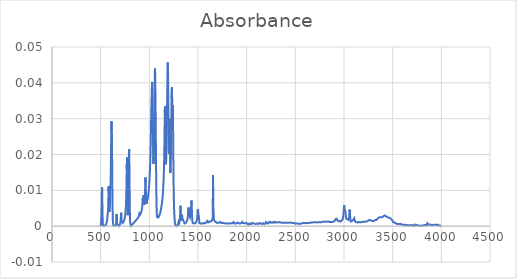
| Category | Absorbance |
|---|---|
| 3997.70514 | 0 |
| 3995.77668 | 0 |
| 3993.84822 | 0 |
| 3991.91975 | 0 |
| 3989.99129 | 0 |
| 3988.06283 | 0 |
| 3986.13436 | 0 |
| 3984.2059 | 0 |
| 3982.27743 | 0 |
| 3980.34897 | 0 |
| 3978.42051 | 0 |
| 3976.49204 | 0 |
| 3974.56358 | 0 |
| 3972.63512 | 0 |
| 3970.70665 | 0 |
| 3968.77819 | 0 |
| 3966.84973 | 0 |
| 3964.92126 | 0 |
| 3962.9928 | 0 |
| 3961.06433 | 0 |
| 3959.13587 | 0 |
| 3957.20741 | 0 |
| 3955.27894 | 0 |
| 3953.35048 | 0 |
| 3951.42202 | 0 |
| 3949.49355 | 0 |
| 3947.56509 | 0 |
| 3945.63663 | 0 |
| 3943.70816 | 0 |
| 3941.7797 | 0 |
| 3939.85123 | 0 |
| 3937.92277 | 0 |
| 3935.99431 | 0 |
| 3934.06584 | 0.001 |
| 3932.13738 | 0.001 |
| 3930.20892 | 0 |
| 3928.28045 | 0 |
| 3926.35199 | 0 |
| 3924.42353 | 0 |
| 3922.49506 | 0 |
| 3920.5666 | 0 |
| 3918.63813 | 0 |
| 3916.70967 | 0 |
| 3914.78121 | 0 |
| 3912.85274 | 0 |
| 3910.92428 | 0 |
| 3908.99582 | 0 |
| 3907.06735 | 0 |
| 3905.13889 | 0 |
| 3903.21043 | 0 |
| 3901.28196 | 0 |
| 3899.3535 | 0.001 |
| 3897.42503 | 0 |
| 3895.49657 | 0 |
| 3893.56811 | 0 |
| 3891.63964 | 0 |
| 3889.71118 | 0 |
| 3887.78272 | 0 |
| 3885.85425 | 0 |
| 3883.92579 | 0 |
| 3881.99733 | 0 |
| 3880.06886 | 0.001 |
| 3878.1404 | 0 |
| 3876.21193 | 0 |
| 3874.28347 | 0 |
| 3872.35501 | 0.001 |
| 3870.42654 | 0.001 |
| 3868.49808 | 0 |
| 3866.56962 | 0 |
| 3864.64115 | 0 |
| 3862.71269 | 0 |
| 3860.78422 | 0 |
| 3858.85576 | 0 |
| 3856.9273 | 0.001 |
| 3854.99883 | 0.001 |
| 3853.07037 | 0.001 |
| 3851.14191 | 0 |
| 3849.21344 | 0 |
| 3847.28498 | 0 |
| 3845.35652 | 0 |
| 3843.42805 | 0 |
| 3841.49959 | 0 |
| 3839.57112 | 0 |
| 3837.64266 | 0 |
| 3835.7142 | 0 |
| 3833.78573 | 0 |
| 3831.85727 | 0 |
| 3829.92881 | 0 |
| 3828.00034 | 0 |
| 3826.07188 | 0 |
| 3824.14342 | 0 |
| 3822.21495 | 0 |
| 3820.28649 | 0 |
| 3818.35802 | 0 |
| 3816.42956 | 0 |
| 3814.5011 | 0 |
| 3812.57263 | 0 |
| 3810.64417 | 0 |
| 3808.71571 | 0 |
| 3806.78724 | 0 |
| 3804.85878 | 0 |
| 3802.93032 | 0 |
| 3801.00185 | 0 |
| 3799.07339 | 0 |
| 3797.14492 | 0 |
| 3795.21646 | 0 |
| 3793.288 | 0 |
| 3791.35953 | 0 |
| 3789.43107 | 0 |
| 3787.50261 | 0 |
| 3785.57414 | 0 |
| 3783.64568 | 0 |
| 3781.71722 | 0 |
| 3779.78875 | 0 |
| 3777.86029 | 0 |
| 3775.93182 | 0 |
| 3774.00336 | 0 |
| 3772.0749 | 0 |
| 3770.14643 | 0 |
| 3768.21797 | 0 |
| 3766.28951 | 0 |
| 3764.36104 | 0 |
| 3762.43258 | 0 |
| 3760.50412 | 0 |
| 3758.57565 | 0 |
| 3756.64719 | 0 |
| 3754.71872 | 0 |
| 3752.79026 | 0 |
| 3750.8618 | 0 |
| 3748.93333 | 0 |
| 3747.00487 | 0 |
| 3745.07641 | 0 |
| 3743.14794 | 0 |
| 3741.21948 | 0 |
| 3739.29102 | 0 |
| 3737.36255 | 0 |
| 3735.43409 | 0 |
| 3733.50562 | 0 |
| 3731.57716 | 0 |
| 3729.6487 | 0 |
| 3727.72023 | 0 |
| 3725.79177 | 0 |
| 3723.86331 | 0 |
| 3721.93484 | 0 |
| 3720.00638 | 0 |
| 3718.07791 | 0 |
| 3716.14945 | 0 |
| 3714.22099 | 0 |
| 3712.29252 | 0 |
| 3710.36406 | 0 |
| 3708.4356 | 0 |
| 3706.50713 | 0 |
| 3704.57867 | 0 |
| 3702.65021 | 0 |
| 3700.72174 | 0 |
| 3698.79328 | 0 |
| 3696.86481 | 0 |
| 3694.93635 | 0 |
| 3693.00789 | 0 |
| 3691.07942 | 0 |
| 3689.15096 | 0 |
| 3687.2225 | 0 |
| 3685.29403 | 0 |
| 3683.36557 | 0 |
| 3681.43711 | 0 |
| 3679.50864 | 0 |
| 3677.58018 | 0 |
| 3675.65171 | 0 |
| 3673.72325 | 0 |
| 3671.79479 | 0 |
| 3669.86632 | 0 |
| 3667.93786 | 0 |
| 3666.0094 | 0 |
| 3664.08093 | 0 |
| 3662.15247 | 0 |
| 3660.22401 | 0 |
| 3658.29554 | 0 |
| 3656.36708 | 0 |
| 3654.43861 | 0 |
| 3652.51015 | 0 |
| 3650.58169 | 0 |
| 3648.65322 | 0 |
| 3646.72476 | 0.001 |
| 3644.7963 | 0 |
| 3642.86783 | 0 |
| 3640.93937 | 0 |
| 3639.01091 | 0 |
| 3637.08244 | 0 |
| 3635.15398 | 0 |
| 3633.22551 | 0 |
| 3631.29705 | 0 |
| 3629.36859 | 0 |
| 3627.44012 | 0 |
| 3625.51166 | 0 |
| 3623.5832 | 0 |
| 3621.65473 | 0 |
| 3619.72627 | 0 |
| 3617.79781 | 0 |
| 3615.86934 | 0 |
| 3613.94088 | 0 |
| 3612.01241 | 0 |
| 3610.08395 | 0 |
| 3608.15549 | 0 |
| 3606.22702 | 0 |
| 3604.29856 | 0 |
| 3602.3701 | 0 |
| 3600.44163 | 0.001 |
| 3598.51317 | 0.001 |
| 3596.58471 | 0.001 |
| 3594.65624 | 0 |
| 3592.72778 | 0 |
| 3590.79931 | 0 |
| 3588.87085 | 0 |
| 3586.94239 | 0.001 |
| 3585.01392 | 0.001 |
| 3583.08546 | 0.001 |
| 3581.157 | 0.001 |
| 3579.22853 | 0.001 |
| 3577.30007 | 0.001 |
| 3575.3716 | 0.001 |
| 3573.44314 | 0.001 |
| 3571.51468 | 0.001 |
| 3569.58621 | 0.001 |
| 3567.65775 | 0.001 |
| 3565.72929 | 0.001 |
| 3563.80082 | 0.001 |
| 3561.87236 | 0.001 |
| 3559.9439 | 0.001 |
| 3558.01543 | 0.001 |
| 3556.08697 | 0.001 |
| 3554.1585 | 0.001 |
| 3552.23004 | 0.001 |
| 3550.30158 | 0.001 |
| 3548.37311 | 0.001 |
| 3546.44465 | 0.001 |
| 3544.51619 | 0.001 |
| 3542.58772 | 0.001 |
| 3540.65926 | 0.001 |
| 3538.7308 | 0.001 |
| 3536.80233 | 0.001 |
| 3534.87387 | 0.001 |
| 3532.9454 | 0.001 |
| 3531.01694 | 0.001 |
| 3529.08848 | 0.001 |
| 3527.16001 | 0.001 |
| 3525.23155 | 0.001 |
| 3523.30309 | 0.001 |
| 3521.37462 | 0.001 |
| 3519.44616 | 0.001 |
| 3517.5177 | 0.001 |
| 3515.58923 | 0.001 |
| 3513.66077 | 0.001 |
| 3511.7323 | 0.001 |
| 3509.80384 | 0.001 |
| 3507.87538 | 0.001 |
| 3505.94691 | 0.001 |
| 3504.01845 | 0.001 |
| 3502.08999 | 0.001 |
| 3500.16152 | 0.001 |
| 3498.23306 | 0.002 |
| 3496.3046 | 0.002 |
| 3494.37613 | 0.002 |
| 3492.44767 | 0.002 |
| 3490.5192 | 0.002 |
| 3488.59074 | 0.002 |
| 3486.66228 | 0.002 |
| 3484.73381 | 0.002 |
| 3482.80535 | 0.002 |
| 3480.87689 | 0.002 |
| 3478.94842 | 0.002 |
| 3477.01996 | 0.002 |
| 3475.0915 | 0.002 |
| 3473.16303 | 0.002 |
| 3471.23457 | 0.002 |
| 3469.3061 | 0.002 |
| 3467.37764 | 0.002 |
| 3465.44918 | 0.002 |
| 3463.52071 | 0.002 |
| 3461.59225 | 0.002 |
| 3459.66379 | 0.002 |
| 3457.73532 | 0.002 |
| 3455.80686 | 0.002 |
| 3453.8784 | 0.002 |
| 3451.94993 | 0.002 |
| 3450.02147 | 0.003 |
| 3448.093 | 0.003 |
| 3446.16454 | 0.003 |
| 3444.23608 | 0.003 |
| 3442.30761 | 0.003 |
| 3440.37915 | 0.003 |
| 3438.45069 | 0.003 |
| 3436.52222 | 0.003 |
| 3434.59376 | 0.003 |
| 3432.66529 | 0.003 |
| 3430.73683 | 0.003 |
| 3428.80837 | 0.003 |
| 3426.8799 | 0.003 |
| 3424.95144 | 0.003 |
| 3423.02298 | 0.003 |
| 3421.09451 | 0.003 |
| 3419.16605 | 0.003 |
| 3417.23759 | 0.003 |
| 3415.30912 | 0.003 |
| 3413.38066 | 0.003 |
| 3411.45219 | 0.003 |
| 3409.52373 | 0.003 |
| 3407.59527 | 0.003 |
| 3405.6668 | 0.003 |
| 3403.73834 | 0.003 |
| 3401.80988 | 0.003 |
| 3399.88141 | 0.003 |
| 3397.95295 | 0.003 |
| 3396.02449 | 0.003 |
| 3394.09602 | 0.003 |
| 3392.16756 | 0.003 |
| 3390.23909 | 0.003 |
| 3388.31063 | 0.003 |
| 3386.38217 | 0.003 |
| 3384.4537 | 0.003 |
| 3382.52524 | 0.003 |
| 3380.59678 | 0.003 |
| 3378.66831 | 0.003 |
| 3376.73985 | 0.003 |
| 3374.81139 | 0.003 |
| 3372.88292 | 0.002 |
| 3370.95446 | 0.002 |
| 3369.02599 | 0.003 |
| 3367.09753 | 0.002 |
| 3365.16907 | 0.002 |
| 3363.2406 | 0.002 |
| 3361.31214 | 0.002 |
| 3359.38368 | 0.002 |
| 3357.45521 | 0.002 |
| 3355.52675 | 0.002 |
| 3353.59829 | 0.002 |
| 3351.66982 | 0.002 |
| 3349.74136 | 0.002 |
| 3347.81289 | 0.002 |
| 3345.88443 | 0.002 |
| 3343.95597 | 0.002 |
| 3342.0275 | 0.002 |
| 3340.09904 | 0.002 |
| 3338.17058 | 0.002 |
| 3336.24211 | 0.002 |
| 3334.31365 | 0.002 |
| 3332.38519 | 0.002 |
| 3330.45672 | 0.002 |
| 3328.52826 | 0.002 |
| 3326.59979 | 0.002 |
| 3324.67133 | 0.002 |
| 3322.74287 | 0.002 |
| 3320.8144 | 0.002 |
| 3318.88594 | 0.002 |
| 3316.95748 | 0.002 |
| 3315.02901 | 0.002 |
| 3313.10055 | 0.002 |
| 3311.17208 | 0.002 |
| 3309.24362 | 0.002 |
| 3307.31516 | 0.001 |
| 3305.38669 | 0.001 |
| 3303.45823 | 0.001 |
| 3301.52977 | 0.001 |
| 3299.6013 | 0.001 |
| 3297.67284 | 0.001 |
| 3295.74438 | 0.001 |
| 3293.81591 | 0.001 |
| 3291.88745 | 0.001 |
| 3289.95898 | 0.001 |
| 3288.03052 | 0.001 |
| 3286.10206 | 0.001 |
| 3284.17359 | 0.002 |
| 3282.24513 | 0.002 |
| 3280.31667 | 0.002 |
| 3278.3882 | 0.002 |
| 3276.45974 | 0.002 |
| 3274.53128 | 0.002 |
| 3272.60281 | 0.002 |
| 3270.67435 | 0.002 |
| 3268.74588 | 0.002 |
| 3266.81742 | 0.002 |
| 3264.88896 | 0.002 |
| 3262.96049 | 0.002 |
| 3261.03203 | 0.002 |
| 3259.10357 | 0.002 |
| 3257.1751 | 0.002 |
| 3255.24664 | 0.002 |
| 3253.31818 | 0.002 |
| 3251.38971 | 0.002 |
| 3249.46125 | 0.002 |
| 3247.53278 | 0.002 |
| 3245.60432 | 0.001 |
| 3243.67586 | 0.001 |
| 3241.74739 | 0.001 |
| 3239.81893 | 0.001 |
| 3237.89047 | 0.001 |
| 3235.962 | 0.001 |
| 3234.03354 | 0.001 |
| 3232.10508 | 0.001 |
| 3230.17661 | 0.001 |
| 3228.24815 | 0.001 |
| 3226.31968 | 0.001 |
| 3224.39122 | 0.001 |
| 3222.46276 | 0.001 |
| 3220.53429 | 0.001 |
| 3218.60583 | 0.001 |
| 3216.67737 | 0.001 |
| 3214.7489 | 0.001 |
| 3212.82044 | 0.001 |
| 3210.89198 | 0.001 |
| 3208.96351 | 0.001 |
| 3207.03505 | 0.001 |
| 3205.10658 | 0.001 |
| 3203.17812 | 0.001 |
| 3201.24966 | 0.001 |
| 3199.32119 | 0.001 |
| 3197.39273 | 0.001 |
| 3195.46427 | 0.001 |
| 3193.5358 | 0.001 |
| 3191.60734 | 0.001 |
| 3189.67888 | 0.001 |
| 3187.75041 | 0.001 |
| 3185.82195 | 0.001 |
| 3183.89348 | 0.001 |
| 3181.96502 | 0.001 |
| 3180.03656 | 0.001 |
| 3178.10809 | 0.001 |
| 3176.17963 | 0.001 |
| 3174.25117 | 0.001 |
| 3172.3227 | 0.001 |
| 3170.39424 | 0.001 |
| 3168.46577 | 0.001 |
| 3166.53731 | 0.001 |
| 3164.60885 | 0.001 |
| 3162.68038 | 0.001 |
| 3160.75192 | 0.001 |
| 3158.82346 | 0.001 |
| 3156.89499 | 0.001 |
| 3154.96653 | 0.001 |
| 3153.03807 | 0.001 |
| 3151.1096 | 0.001 |
| 3149.18114 | 0.001 |
| 3147.25267 | 0.001 |
| 3145.32421 | 0.001 |
| 3143.39575 | 0.001 |
| 3141.46728 | 0.001 |
| 3139.53882 | 0.001 |
| 3137.61036 | 0.001 |
| 3135.68189 | 0.001 |
| 3133.75343 | 0.001 |
| 3131.82497 | 0.001 |
| 3129.8965 | 0.001 |
| 3127.96804 | 0.001 |
| 3126.03957 | 0.001 |
| 3124.11111 | 0.001 |
| 3122.18265 | 0.001 |
| 3120.25418 | 0.001 |
| 3118.32572 | 0.001 |
| 3116.39726 | 0.001 |
| 3114.46879 | 0.001 |
| 3112.54033 | 0.001 |
| 3110.61187 | 0.001 |
| 3108.6834 | 0.002 |
| 3106.75494 | 0.002 |
| 3104.82647 | 0.002 |
| 3102.89801 | 0.002 |
| 3100.96955 | 0.002 |
| 3099.04108 | 0.002 |
| 3097.11262 | 0.002 |
| 3095.18416 | 0.002 |
| 3093.25569 | 0.002 |
| 3091.32723 | 0.002 |
| 3089.39877 | 0.002 |
| 3087.4703 | 0.002 |
| 3085.54184 | 0.002 |
| 3083.61337 | 0.002 |
| 3081.68491 | 0.001 |
| 3079.75645 | 0.001 |
| 3077.82798 | 0.001 |
| 3075.89952 | 0.001 |
| 3073.97106 | 0.001 |
| 3072.04259 | 0.001 |
| 3070.11413 | 0.001 |
| 3068.18567 | 0.001 |
| 3066.2572 | 0.002 |
| 3064.32874 | 0.002 |
| 3062.40027 | 0.003 |
| 3060.47181 | 0.004 |
| 3058.54335 | 0.005 |
| 3056.61488 | 0.004 |
| 3054.68642 | 0.003 |
| 3052.75796 | 0.002 |
| 3050.82949 | 0.002 |
| 3048.90103 | 0.002 |
| 3046.97257 | 0.002 |
| 3045.0441 | 0.002 |
| 3043.11564 | 0.002 |
| 3041.18717 | 0.002 |
| 3039.25871 | 0.002 |
| 3037.33025 | 0.002 |
| 3035.40178 | 0.002 |
| 3033.47332 | 0.002 |
| 3031.54486 | 0.002 |
| 3029.61639 | 0.002 |
| 3027.68793 | 0.002 |
| 3025.75946 | 0.002 |
| 3023.831 | 0.002 |
| 3021.90254 | 0.002 |
| 3019.97407 | 0.003 |
| 3018.04561 | 0.003 |
| 3016.11715 | 0.004 |
| 3014.18868 | 0.004 |
| 3012.26022 | 0.004 |
| 3010.33176 | 0.004 |
| 3008.40329 | 0.004 |
| 3006.47483 | 0.005 |
| 3004.54636 | 0.005 |
| 3002.6179 | 0.006 |
| 3000.68944 | 0.006 |
| 2998.76097 | 0.005 |
| 2996.83251 | 0.004 |
| 2994.90405 | 0.003 |
| 2992.97558 | 0.003 |
| 2991.04712 | 0.003 |
| 2989.11866 | 0.002 |
| 2987.19019 | 0.002 |
| 2985.26173 | 0.002 |
| 2983.33326 | 0.002 |
| 2981.4048 | 0.002 |
| 2979.47634 | 0.002 |
| 2977.54787 | 0.002 |
| 2975.61941 | 0.002 |
| 2973.69095 | 0.002 |
| 2971.76248 | 0.001 |
| 2969.83402 | 0.001 |
| 2967.90556 | 0.001 |
| 2965.97709 | 0.001 |
| 2964.04863 | 0.001 |
| 2962.12016 | 0.001 |
| 2960.1917 | 0.001 |
| 2958.26324 | 0.001 |
| 2956.33477 | 0.001 |
| 2954.40631 | 0.001 |
| 2952.47785 | 0.001 |
| 2950.54938 | 0.001 |
| 2948.62092 | 0.001 |
| 2946.69246 | 0.001 |
| 2944.76399 | 0.001 |
| 2942.83553 | 0.001 |
| 2940.90706 | 0.001 |
| 2938.9786 | 0.001 |
| 2937.05014 | 0.001 |
| 2935.12167 | 0.001 |
| 2933.19321 | 0.001 |
| 2931.26475 | 0.002 |
| 2929.33628 | 0.002 |
| 2927.40782 | 0.002 |
| 2925.47936 | 0.002 |
| 2923.55089 | 0.002 |
| 2921.62243 | 0.002 |
| 2919.69396 | 0.002 |
| 2917.7655 | 0.002 |
| 2915.83704 | 0.002 |
| 2913.90857 | 0.002 |
| 2911.98011 | 0.002 |
| 2910.05165 | 0.002 |
| 2908.12318 | 0.002 |
| 2906.19472 | 0.002 |
| 2904.26626 | 0.001 |
| 2902.33779 | 0.001 |
| 2900.40933 | 0.001 |
| 2898.48086 | 0.001 |
| 2896.5524 | 0.001 |
| 2894.62394 | 0.001 |
| 2892.69547 | 0.001 |
| 2890.76701 | 0.001 |
| 2888.83855 | 0.001 |
| 2886.91008 | 0.001 |
| 2884.98162 | 0.001 |
| 2883.05315 | 0.001 |
| 2881.12469 | 0.001 |
| 2879.19623 | 0.001 |
| 2877.26776 | 0.001 |
| 2875.3393 | 0.001 |
| 2873.41084 | 0.001 |
| 2871.48237 | 0.001 |
| 2869.55391 | 0.001 |
| 2867.62545 | 0.001 |
| 2865.69698 | 0.001 |
| 2863.76852 | 0.001 |
| 2861.84005 | 0.001 |
| 2859.91159 | 0.001 |
| 2857.98313 | 0.001 |
| 2856.05466 | 0.001 |
| 2854.1262 | 0.001 |
| 2852.19774 | 0.001 |
| 2850.26927 | 0.001 |
| 2848.34081 | 0.001 |
| 2846.41235 | 0.001 |
| 2844.48388 | 0.001 |
| 2842.55542 | 0.001 |
| 2840.62695 | 0.001 |
| 2838.69849 | 0.001 |
| 2836.77003 | 0.001 |
| 2834.84156 | 0.001 |
| 2832.9131 | 0.001 |
| 2830.98464 | 0.001 |
| 2829.05617 | 0.001 |
| 2827.12771 | 0.001 |
| 2825.19925 | 0.001 |
| 2823.27078 | 0.001 |
| 2821.34232 | 0.001 |
| 2819.41385 | 0.001 |
| 2817.48539 | 0.001 |
| 2815.55693 | 0.001 |
| 2813.62846 | 0.001 |
| 2811.7 | 0.001 |
| 2809.77154 | 0.001 |
| 2807.84307 | 0.001 |
| 2805.91461 | 0.001 |
| 2803.98615 | 0.001 |
| 2802.05768 | 0.001 |
| 2800.12922 | 0.001 |
| 2798.20075 | 0.001 |
| 2796.27229 | 0.001 |
| 2794.34383 | 0.001 |
| 2792.41536 | 0.001 |
| 2790.4869 | 0.001 |
| 2788.55844 | 0.001 |
| 2786.62997 | 0.001 |
| 2784.70151 | 0.001 |
| 2782.77305 | 0.001 |
| 2780.84458 | 0.001 |
| 2778.91612 | 0.001 |
| 2776.98765 | 0.001 |
| 2775.05919 | 0.001 |
| 2773.13073 | 0.001 |
| 2771.20226 | 0.001 |
| 2769.2738 | 0.001 |
| 2767.34534 | 0.001 |
| 2765.41687 | 0.001 |
| 2763.48841 | 0.001 |
| 2761.55995 | 0.001 |
| 2759.63148 | 0.001 |
| 2757.70302 | 0.001 |
| 2755.77455 | 0.001 |
| 2753.84609 | 0.001 |
| 2751.91763 | 0.001 |
| 2749.98916 | 0.001 |
| 2748.0607 | 0.001 |
| 2746.13224 | 0.001 |
| 2744.20377 | 0.001 |
| 2742.27531 | 0.001 |
| 2740.34684 | 0.001 |
| 2738.41838 | 0.001 |
| 2736.48992 | 0.001 |
| 2734.56145 | 0.001 |
| 2732.63299 | 0.001 |
| 2730.70453 | 0.001 |
| 2728.77606 | 0.001 |
| 2726.8476 | 0.001 |
| 2724.91914 | 0.001 |
| 2722.99067 | 0.001 |
| 2721.06221 | 0.001 |
| 2719.13374 | 0.001 |
| 2717.20528 | 0.001 |
| 2715.27682 | 0.001 |
| 2713.34835 | 0.001 |
| 2711.41989 | 0.001 |
| 2709.49143 | 0.001 |
| 2707.56296 | 0.001 |
| 2705.6345 | 0.001 |
| 2703.70604 | 0.001 |
| 2701.77757 | 0.001 |
| 2699.84911 | 0.001 |
| 2697.92064 | 0.001 |
| 2695.99218 | 0.001 |
| 2694.06372 | 0.001 |
| 2692.13525 | 0.001 |
| 2690.20679 | 0.001 |
| 2688.27833 | 0.001 |
| 2686.34986 | 0.001 |
| 2684.4214 | 0.001 |
| 2682.49294 | 0.001 |
| 2680.56447 | 0.001 |
| 2678.63601 | 0.001 |
| 2676.70754 | 0.001 |
| 2674.77908 | 0.001 |
| 2672.85062 | 0.001 |
| 2670.92215 | 0.001 |
| 2668.99369 | 0.001 |
| 2667.06523 | 0.001 |
| 2665.13676 | 0.001 |
| 2663.2083 | 0.001 |
| 2661.27984 | 0.001 |
| 2659.35137 | 0.001 |
| 2657.42291 | 0.001 |
| 2655.49444 | 0.001 |
| 2653.56598 | 0.001 |
| 2651.63752 | 0.001 |
| 2649.70905 | 0.001 |
| 2647.78059 | 0.001 |
| 2645.85213 | 0.001 |
| 2643.92366 | 0.001 |
| 2641.9952 | 0.001 |
| 2640.06674 | 0.001 |
| 2638.13827 | 0.001 |
| 2636.20981 | 0.001 |
| 2634.28134 | 0.001 |
| 2632.35288 | 0.001 |
| 2630.42442 | 0.001 |
| 2628.49595 | 0.001 |
| 2626.56749 | 0.001 |
| 2624.63903 | 0.001 |
| 2622.71056 | 0.001 |
| 2620.7821 | 0.001 |
| 2618.85364 | 0.001 |
| 2616.92517 | 0.001 |
| 2614.99671 | 0.001 |
| 2613.06824 | 0.001 |
| 2611.13978 | 0.001 |
| 2609.21132 | 0.001 |
| 2607.28285 | 0.001 |
| 2605.35439 | 0.001 |
| 2603.42593 | 0.001 |
| 2601.49746 | 0.001 |
| 2599.569 | 0.001 |
| 2597.64053 | 0.001 |
| 2595.71207 | 0.001 |
| 2593.78361 | 0.001 |
| 2591.85514 | 0.001 |
| 2589.92668 | 0.001 |
| 2587.99822 | 0.001 |
| 2586.06975 | 0.001 |
| 2584.14129 | 0.001 |
| 2582.21283 | 0.001 |
| 2580.28436 | 0.001 |
| 2578.3559 | 0.001 |
| 2576.42743 | 0.001 |
| 2574.49897 | 0.001 |
| 2572.57051 | 0.001 |
| 2570.64204 | 0.001 |
| 2568.71358 | 0.001 |
| 2566.78512 | 0.001 |
| 2564.85665 | 0.001 |
| 2562.92819 | 0.001 |
| 2560.99973 | 0.001 |
| 2559.07126 | 0.001 |
| 2557.1428 | 0.001 |
| 2555.21433 | 0.001 |
| 2553.28587 | 0.001 |
| 2551.35741 | 0.001 |
| 2549.42894 | 0.001 |
| 2547.50048 | 0.001 |
| 2545.57202 | 0.001 |
| 2543.64355 | 0.001 |
| 2541.71509 | 0.001 |
| 2539.78663 | 0.001 |
| 2537.85816 | 0.001 |
| 2535.9297 | 0.001 |
| 2534.00123 | 0.001 |
| 2532.07277 | 0.001 |
| 2530.14431 | 0.001 |
| 2528.21584 | 0.001 |
| 2526.28738 | 0.001 |
| 2524.35892 | 0.001 |
| 2522.43045 | 0.001 |
| 2520.50199 | 0.001 |
| 2518.57353 | 0.001 |
| 2516.64506 | 0.001 |
| 2514.7166 | 0.001 |
| 2512.78813 | 0.001 |
| 2510.85967 | 0.001 |
| 2508.93121 | 0.001 |
| 2507.00274 | 0.001 |
| 2505.07428 | 0.001 |
| 2503.14582 | 0.001 |
| 2501.21735 | 0.001 |
| 2499.28889 | 0.001 |
| 2497.36043 | 0.001 |
| 2495.43196 | 0.001 |
| 2493.5035 | 0.001 |
| 2491.57503 | 0.001 |
| 2489.64657 | 0.001 |
| 2487.71811 | 0.001 |
| 2485.78964 | 0.001 |
| 2483.86118 | 0.001 |
| 2481.93272 | 0.001 |
| 2480.00425 | 0.001 |
| 2478.07579 | 0.001 |
| 2476.14733 | 0.001 |
| 2474.21886 | 0.001 |
| 2472.2904 | 0.001 |
| 2470.36193 | 0.001 |
| 2468.43347 | 0.001 |
| 2466.50501 | 0.001 |
| 2464.57654 | 0.001 |
| 2462.64808 | 0.001 |
| 2460.71962 | 0.001 |
| 2458.79115 | 0.001 |
| 2456.86269 | 0.001 |
| 2454.93422 | 0.001 |
| 2453.00576 | 0.001 |
| 2451.0773 | 0.001 |
| 2449.14883 | 0.001 |
| 2447.22037 | 0.001 |
| 2445.29191 | 0.001 |
| 2443.36344 | 0.001 |
| 2441.43498 | 0.001 |
| 2439.50652 | 0.001 |
| 2437.57805 | 0.001 |
| 2435.64959 | 0.001 |
| 2433.72112 | 0.001 |
| 2431.79266 | 0.001 |
| 2429.8642 | 0.001 |
| 2427.93573 | 0.001 |
| 2426.00727 | 0.001 |
| 2424.07881 | 0.001 |
| 2422.15034 | 0.001 |
| 2420.22188 | 0.001 |
| 2418.29342 | 0.001 |
| 2416.36495 | 0.001 |
| 2414.43649 | 0.001 |
| 2412.50802 | 0.001 |
| 2410.57956 | 0.001 |
| 2408.6511 | 0.001 |
| 2406.72263 | 0.001 |
| 2404.79417 | 0.001 |
| 2402.86571 | 0.001 |
| 2400.93724 | 0.001 |
| 2399.00878 | 0.001 |
| 2397.08032 | 0.001 |
| 2395.15185 | 0.001 |
| 2393.22339 | 0.001 |
| 2391.29492 | 0.001 |
| 2389.36646 | 0.001 |
| 2387.438 | 0.001 |
| 2385.50953 | 0.001 |
| 2383.58107 | 0.001 |
| 2381.65261 | 0.001 |
| 2379.72414 | 0.001 |
| 2377.79568 | 0.001 |
| 2375.86722 | 0.001 |
| 2373.93875 | 0.001 |
| 2372.01029 | 0.001 |
| 2370.08182 | 0.001 |
| 2368.15336 | 0.001 |
| 2366.2249 | 0.001 |
| 2364.29643 | 0.001 |
| 2362.36797 | 0.001 |
| 2360.43951 | 0.001 |
| 2358.51104 | 0.001 |
| 2356.58258 | 0.001 |
| 2354.65412 | 0.001 |
| 2352.72565 | 0.001 |
| 2350.79719 | 0.001 |
| 2348.86872 | 0.001 |
| 2346.94026 | 0.001 |
| 2345.0118 | 0.001 |
| 2343.08333 | 0.001 |
| 2341.15487 | 0.001 |
| 2339.22641 | 0.001 |
| 2337.29794 | 0.001 |
| 2335.36948 | 0.001 |
| 2333.44102 | 0.001 |
| 2331.51255 | 0.001 |
| 2329.58409 | 0.001 |
| 2327.65562 | 0.001 |
| 2325.72716 | 0.001 |
| 2323.7987 | 0.001 |
| 2321.87023 | 0.001 |
| 2319.94177 | 0.001 |
| 2318.01331 | 0.001 |
| 2316.08484 | 0.001 |
| 2314.15638 | 0.001 |
| 2312.22791 | 0.001 |
| 2310.29945 | 0.001 |
| 2308.37099 | 0.001 |
| 2306.44252 | 0.001 |
| 2304.51406 | 0.001 |
| 2302.5856 | 0.001 |
| 2300.65713 | 0.001 |
| 2298.72867 | 0.001 |
| 2296.80021 | 0.001 |
| 2294.87174 | 0.001 |
| 2292.94328 | 0.001 |
| 2291.01481 | 0.001 |
| 2289.08635 | 0.001 |
| 2287.15789 | 0.001 |
| 2285.22942 | 0.001 |
| 2283.30096 | 0.001 |
| 2281.3725 | 0.001 |
| 2279.44403 | 0.001 |
| 2277.51557 | 0.001 |
| 2275.58711 | 0.001 |
| 2273.65864 | 0.001 |
| 2271.73018 | 0.001 |
| 2269.80171 | 0.001 |
| 2267.87325 | 0.001 |
| 2265.94479 | 0.001 |
| 2264.01632 | 0.001 |
| 2262.08786 | 0.001 |
| 2260.1594 | 0.001 |
| 2258.23093 | 0.001 |
| 2256.30247 | 0.001 |
| 2254.37401 | 0.001 |
| 2252.44554 | 0.001 |
| 2250.51708 | 0.001 |
| 2248.58861 | 0.001 |
| 2246.66015 | 0.001 |
| 2244.73169 | 0.001 |
| 2242.80322 | 0.001 |
| 2240.87476 | 0.001 |
| 2238.9463 | 0.001 |
| 2237.01783 | 0.001 |
| 2235.08937 | 0.001 |
| 2233.16091 | 0.001 |
| 2231.23244 | 0.001 |
| 2229.30398 | 0.001 |
| 2227.37551 | 0.001 |
| 2225.44705 | 0.001 |
| 2223.51859 | 0.001 |
| 2221.59012 | 0.001 |
| 2219.66166 | 0.001 |
| 2217.7332 | 0.001 |
| 2215.80473 | 0.001 |
| 2213.87627 | 0.001 |
| 2211.94781 | 0.001 |
| 2210.01934 | 0.001 |
| 2208.09088 | 0.001 |
| 2206.16241 | 0.001 |
| 2204.23395 | 0.001 |
| 2202.30549 | 0.001 |
| 2200.37702 | 0.001 |
| 2198.44856 | 0.001 |
| 2196.5201 | 0.001 |
| 2194.59163 | 0.001 |
| 2192.66317 | 0.001 |
| 2190.73471 | 0.001 |
| 2188.80624 | 0.001 |
| 2186.87778 | 0.001 |
| 2184.94931 | 0.001 |
| 2183.02085 | 0.001 |
| 2181.09239 | 0.001 |
| 2179.16392 | 0.001 |
| 2177.23546 | 0.001 |
| 2175.307 | 0.001 |
| 2173.37853 | 0.001 |
| 2171.45007 | 0.001 |
| 2169.5216 | 0.001 |
| 2167.59314 | 0.001 |
| 2165.66468 | 0.001 |
| 2163.73621 | 0.001 |
| 2161.80775 | 0.001 |
| 2159.87929 | 0.001 |
| 2157.95082 | 0.001 |
| 2156.02236 | 0.001 |
| 2154.0939 | 0.001 |
| 2152.16543 | 0.001 |
| 2150.23697 | 0.001 |
| 2148.3085 | 0.001 |
| 2146.38004 | 0.001 |
| 2144.45158 | 0.001 |
| 2142.52311 | 0.001 |
| 2140.59465 | 0.001 |
| 2138.66619 | 0.001 |
| 2136.73772 | 0.001 |
| 2134.80926 | 0.001 |
| 2132.8808 | 0.001 |
| 2130.95233 | 0.001 |
| 2129.02387 | 0.001 |
| 2127.0954 | 0.001 |
| 2125.16694 | 0.001 |
| 2123.23848 | 0.001 |
| 2121.31001 | 0.001 |
| 2119.38155 | 0.001 |
| 2117.45309 | 0.001 |
| 2115.52462 | 0.001 |
| 2113.59616 | 0.001 |
| 2111.6677 | 0.001 |
| 2109.73923 | 0.001 |
| 2107.81077 | 0.001 |
| 2105.8823 | 0.001 |
| 2103.95384 | 0.001 |
| 2102.02538 | 0.001 |
| 2100.09691 | 0.001 |
| 2098.16845 | 0.001 |
| 2096.23999 | 0.001 |
| 2094.31152 | 0.001 |
| 2092.38306 | 0.001 |
| 2090.4546 | 0.001 |
| 2088.52613 | 0.001 |
| 2086.59767 | 0.001 |
| 2084.6692 | 0.001 |
| 2082.74074 | 0.001 |
| 2080.81228 | 0.001 |
| 2078.88381 | 0.001 |
| 2076.95535 | 0.001 |
| 2075.02689 | 0.001 |
| 2073.09842 | 0.001 |
| 2071.16996 | 0.001 |
| 2069.2415 | 0.001 |
| 2067.31303 | 0.001 |
| 2065.38457 | 0.001 |
| 2063.4561 | 0.001 |
| 2061.52764 | 0.001 |
| 2059.59918 | 0.001 |
| 2057.67071 | 0.001 |
| 2055.74225 | 0.001 |
| 2053.81379 | 0.001 |
| 2051.88532 | 0.001 |
| 2049.95686 | 0.001 |
| 2048.0284 | 0.001 |
| 2046.09993 | 0 |
| 2044.17147 | 0 |
| 2042.243 | 0.001 |
| 2040.31454 | 0.001 |
| 2038.38608 | 0.001 |
| 2036.45761 | 0.001 |
| 2034.52915 | 0 |
| 2032.60069 | 0 |
| 2030.67222 | 0 |
| 2028.74376 | 0.001 |
| 2026.81529 | 0.001 |
| 2024.88683 | 0.001 |
| 2022.95837 | 0.001 |
| 2021.0299 | 0.001 |
| 2019.10144 | 0 |
| 2017.17298 | 0 |
| 2015.24451 | 0 |
| 2013.31605 | 0.001 |
| 2011.38759 | 0.001 |
| 2009.45912 | 0.001 |
| 2007.53066 | 0.001 |
| 2005.60219 | 0.001 |
| 2003.67373 | 0 |
| 2001.74527 | 0 |
| 1999.8168 | 0.001 |
| 1997.88834 | 0.001 |
| 1995.95988 | 0.001 |
| 1994.03141 | 0.001 |
| 1992.10295 | 0.001 |
| 1990.17449 | 0.001 |
| 1988.24602 | 0.001 |
| 1986.31756 | 0.001 |
| 1984.38909 | 0.001 |
| 1982.46063 | 0.001 |
| 1980.53217 | 0.001 |
| 1978.6037 | 0.001 |
| 1976.67524 | 0.001 |
| 1974.74678 | 0.001 |
| 1972.81831 | 0.001 |
| 1970.88985 | 0.001 |
| 1968.96139 | 0.001 |
| 1967.03292 | 0.001 |
| 1965.10446 | 0.001 |
| 1963.17599 | 0.001 |
| 1961.24753 | 0.001 |
| 1959.31907 | 0.001 |
| 1957.3906 | 0.001 |
| 1955.46214 | 0.001 |
| 1953.53368 | 0.001 |
| 1951.60521 | 0.001 |
| 1949.67675 | 0.001 |
| 1947.74829 | 0.001 |
| 1945.81982 | 0.001 |
| 1943.89136 | 0.001 |
| 1941.96289 | 0.001 |
| 1940.03443 | 0.001 |
| 1938.10597 | 0.001 |
| 1936.1775 | 0.001 |
| 1934.24904 | 0.001 |
| 1932.32058 | 0.001 |
| 1930.39211 | 0.001 |
| 1928.46365 | 0.001 |
| 1926.53519 | 0.001 |
| 1924.60672 | 0.001 |
| 1922.67826 | 0.001 |
| 1920.74979 | 0.001 |
| 1918.82133 | 0.001 |
| 1916.89287 | 0.001 |
| 1914.9644 | 0.001 |
| 1913.03594 | 0.001 |
| 1911.10748 | 0.001 |
| 1909.17901 | 0.001 |
| 1907.25055 | 0.001 |
| 1905.32209 | 0.001 |
| 1903.39362 | 0.001 |
| 1901.46516 | 0.001 |
| 1899.53669 | 0.001 |
| 1897.60823 | 0.001 |
| 1895.67977 | 0.001 |
| 1893.7513 | 0.001 |
| 1891.82284 | 0.001 |
| 1889.89438 | 0.001 |
| 1887.96591 | 0.001 |
| 1886.03745 | 0.001 |
| 1884.10898 | 0.001 |
| 1882.18052 | 0.001 |
| 1880.25206 | 0.001 |
| 1878.32359 | 0.001 |
| 1876.39513 | 0.001 |
| 1874.46667 | 0.001 |
| 1872.5382 | 0.001 |
| 1870.60974 | 0.001 |
| 1868.68128 | 0.001 |
| 1866.75281 | 0.001 |
| 1864.82435 | 0.001 |
| 1862.89588 | 0.001 |
| 1860.96742 | 0.001 |
| 1859.03896 | 0.001 |
| 1857.11049 | 0.001 |
| 1855.18203 | 0.001 |
| 1853.25357 | 0.001 |
| 1851.3251 | 0.001 |
| 1849.39664 | 0.001 |
| 1847.46818 | 0.001 |
| 1845.53971 | 0.001 |
| 1843.61125 | 0.001 |
| 1841.68278 | 0.001 |
| 1839.75432 | 0.001 |
| 1837.82586 | 0.001 |
| 1835.89739 | 0.001 |
| 1833.96893 | 0.001 |
| 1832.04047 | 0.001 |
| 1830.112 | 0.001 |
| 1828.18354 | 0.001 |
| 1826.25508 | 0.001 |
| 1824.32661 | 0.001 |
| 1822.39815 | 0.001 |
| 1820.46968 | 0.001 |
| 1818.54122 | 0.001 |
| 1816.61276 | 0.001 |
| 1814.68429 | 0.001 |
| 1812.75583 | 0.001 |
| 1810.82737 | 0.001 |
| 1808.8989 | 0.001 |
| 1806.97044 | 0.001 |
| 1805.04198 | 0.001 |
| 1803.11351 | 0.001 |
| 1801.18505 | 0.001 |
| 1799.25658 | 0.001 |
| 1797.32812 | 0.001 |
| 1795.39966 | 0.001 |
| 1793.47119 | 0.001 |
| 1791.54273 | 0.001 |
| 1789.61427 | 0.001 |
| 1787.6858 | 0.001 |
| 1785.75734 | 0.001 |
| 1783.82888 | 0.001 |
| 1781.90041 | 0.001 |
| 1779.97195 | 0.001 |
| 1778.04348 | 0.001 |
| 1776.11502 | 0.001 |
| 1774.18656 | 0.001 |
| 1772.25809 | 0.001 |
| 1770.32963 | 0.001 |
| 1768.40117 | 0.001 |
| 1766.4727 | 0.001 |
| 1764.54424 | 0.001 |
| 1762.61578 | 0.001 |
| 1760.68731 | 0.001 |
| 1758.75885 | 0.001 |
| 1756.83038 | 0.001 |
| 1754.90192 | 0.001 |
| 1752.97346 | 0.001 |
| 1751.04499 | 0.001 |
| 1749.11653 | 0.001 |
| 1747.18807 | 0.001 |
| 1745.2596 | 0.001 |
| 1743.33114 | 0.001 |
| 1741.40267 | 0.001 |
| 1739.47421 | 0.001 |
| 1737.54575 | 0.001 |
| 1735.61728 | 0.001 |
| 1733.68882 | 0.001 |
| 1731.76036 | 0.001 |
| 1729.83189 | 0.001 |
| 1727.90343 | 0.001 |
| 1725.97497 | 0.001 |
| 1724.0465 | 0.001 |
| 1722.11804 | 0.001 |
| 1720.18957 | 0.001 |
| 1718.26111 | 0.001 |
| 1716.33265 | 0.001 |
| 1714.40418 | 0.001 |
| 1712.47572 | 0.001 |
| 1710.54726 | 0.001 |
| 1708.61879 | 0.001 |
| 1706.69033 | 0.001 |
| 1704.76187 | 0.001 |
| 1702.8334 | 0.001 |
| 1700.90494 | 0.001 |
| 1698.97647 | 0.001 |
| 1697.04801 | 0.001 |
| 1695.11955 | 0.001 |
| 1693.19108 | 0.001 |
| 1691.26262 | 0.001 |
| 1689.33416 | 0.001 |
| 1687.40569 | 0.001 |
| 1685.47723 | 0.001 |
| 1683.54877 | 0.001 |
| 1681.6203 | 0.001 |
| 1679.69184 | 0.001 |
| 1677.76337 | 0.001 |
| 1675.83491 | 0.001 |
| 1673.90645 | 0.001 |
| 1671.97798 | 0.001 |
| 1670.04952 | 0.001 |
| 1668.12106 | 0.002 |
| 1666.19259 | 0.002 |
| 1664.26413 | 0.002 |
| 1662.33567 | 0.002 |
| 1660.4072 | 0.004 |
| 1658.47874 | 0.005 |
| 1656.55027 | 0.007 |
| 1654.62181 | 0.014 |
| 1652.69335 | 0.007 |
| 1650.76488 | 0.002 |
| 1648.83642 | 0.002 |
| 1646.90796 | 0.002 |
| 1644.97949 | 0.002 |
| 1643.05103 | 0.002 |
| 1641.12257 | 0.002 |
| 1639.1941 | 0.001 |
| 1637.26564 | 0.001 |
| 1635.33717 | 0.001 |
| 1633.40871 | 0.001 |
| 1631.48025 | 0.001 |
| 1629.55178 | 0.001 |
| 1627.62332 | 0.001 |
| 1625.69486 | 0.001 |
| 1623.76639 | 0.001 |
| 1621.83793 | 0.001 |
| 1619.90946 | 0.001 |
| 1617.981 | 0.001 |
| 1616.05254 | 0.001 |
| 1614.12407 | 0.001 |
| 1612.19561 | 0.001 |
| 1610.26715 | 0.001 |
| 1608.33868 | 0.001 |
| 1606.41022 | 0.001 |
| 1604.48176 | 0.001 |
| 1602.55329 | 0.001 |
| 1600.62483 | 0.001 |
| 1598.69636 | 0.001 |
| 1596.7679 | 0.001 |
| 1594.83944 | 0.001 |
| 1592.91097 | 0.002 |
| 1590.98251 | 0.002 |
| 1589.05405 | 0.002 |
| 1587.12558 | 0.001 |
| 1585.19712 | 0.001 |
| 1583.26866 | 0.001 |
| 1581.34019 | 0.001 |
| 1579.41173 | 0.001 |
| 1577.48326 | 0.001 |
| 1575.5548 | 0.001 |
| 1573.62634 | 0.001 |
| 1571.69787 | 0.001 |
| 1569.76941 | 0.001 |
| 1567.84095 | 0.001 |
| 1565.91248 | 0.001 |
| 1563.98402 | 0.001 |
| 1562.05556 | 0.001 |
| 1560.12709 | 0.001 |
| 1558.19863 | 0.001 |
| 1556.27016 | 0.001 |
| 1554.3417 | 0.001 |
| 1552.41324 | 0.001 |
| 1550.48477 | 0.001 |
| 1548.55631 | 0.001 |
| 1546.62785 | 0.001 |
| 1544.69938 | 0.001 |
| 1542.77092 | 0.001 |
| 1540.84246 | 0.001 |
| 1538.91399 | 0.001 |
| 1536.98553 | 0.001 |
| 1535.05706 | 0.001 |
| 1533.1286 | 0.001 |
| 1531.20014 | 0.001 |
| 1529.27167 | 0.001 |
| 1527.34321 | 0.001 |
| 1525.41475 | 0.001 |
| 1523.48628 | 0.001 |
| 1521.55782 | 0.001 |
| 1519.62936 | 0.001 |
| 1517.70089 | 0.001 |
| 1515.77243 | 0.001 |
| 1513.84396 | 0.001 |
| 1511.9155 | 0.002 |
| 1509.98704 | 0.002 |
| 1508.05857 | 0.003 |
| 1506.13011 | 0.003 |
| 1504.20165 | 0.003 |
| 1502.27318 | 0.004 |
| 1500.34472 | 0.005 |
| 1498.41626 | 0.005 |
| 1496.48779 | 0.004 |
| 1494.55933 | 0.003 |
| 1492.63086 | 0.003 |
| 1490.7024 | 0.002 |
| 1488.77394 | 0.002 |
| 1486.84547 | 0.002 |
| 1484.91701 | 0.001 |
| 1482.98855 | 0.001 |
| 1481.06008 | 0.001 |
| 1479.13162 | 0.001 |
| 1477.20315 | 0.001 |
| 1475.27469 | 0.001 |
| 1473.34623 | 0.001 |
| 1471.41776 | 0.001 |
| 1469.4893 | 0.001 |
| 1467.56084 | 0.001 |
| 1465.63237 | 0.001 |
| 1463.70391 | 0.001 |
| 1461.77545 | 0.001 |
| 1459.84698 | 0.001 |
| 1457.91852 | 0.001 |
| 1455.99005 | 0.001 |
| 1454.06159 | 0.001 |
| 1452.13313 | 0.001 |
| 1450.20466 | 0.001 |
| 1448.2762 | 0.001 |
| 1446.34774 | 0.001 |
| 1444.41927 | 0.001 |
| 1442.49081 | 0.001 |
| 1440.56235 | 0.002 |
| 1438.63388 | 0.003 |
| 1436.70542 | 0.005 |
| 1434.77695 | 0.007 |
| 1432.84849 | 0.007 |
| 1430.92003 | 0.006 |
| 1428.99156 | 0.005 |
| 1427.0631 | 0.005 |
| 1425.13464 | 0.004 |
| 1423.20617 | 0.004 |
| 1421.27771 | 0.003 |
| 1419.34925 | 0.003 |
| 1417.42078 | 0.003 |
| 1415.49232 | 0.002 |
| 1413.56385 | 0.002 |
| 1411.63539 | 0.002 |
| 1409.70693 | 0.003 |
| 1407.77846 | 0.003 |
| 1405.85 | 0.004 |
| 1403.92154 | 0.005 |
| 1401.99307 | 0.005 |
| 1400.06461 | 0.005 |
| 1398.13615 | 0.004 |
| 1396.20768 | 0.003 |
| 1394.27922 | 0.002 |
| 1392.35075 | 0.002 |
| 1390.42229 | 0.002 |
| 1388.49383 | 0.002 |
| 1386.56536 | 0.001 |
| 1384.6369 | 0.001 |
| 1382.70844 | 0.001 |
| 1380.77997 | 0.001 |
| 1378.85151 | 0.001 |
| 1376.92305 | 0.001 |
| 1374.99458 | 0.001 |
| 1373.06612 | 0.001 |
| 1371.13765 | 0.001 |
| 1369.20919 | 0.001 |
| 1367.28073 | 0.001 |
| 1365.35226 | 0.001 |
| 1363.4238 | 0.001 |
| 1361.49534 | 0.001 |
| 1359.56687 | 0.001 |
| 1357.63841 | 0.001 |
| 1355.70995 | 0.001 |
| 1353.78148 | 0.001 |
| 1351.85302 | 0.001 |
| 1349.92455 | 0.001 |
| 1347.99609 | 0.001 |
| 1346.06763 | 0.001 |
| 1344.13916 | 0.001 |
| 1342.2107 | 0.001 |
| 1340.28224 | 0.002 |
| 1338.35377 | 0.003 |
| 1336.42531 | 0.003 |
| 1334.49684 | 0.003 |
| 1332.56838 | 0.002 |
| 1330.63992 | 0.002 |
| 1328.71145 | 0.002 |
| 1326.78299 | 0.002 |
| 1324.85453 | 0.003 |
| 1322.92606 | 0.005 |
| 1320.9976 | 0.006 |
| 1319.06914 | 0.005 |
| 1317.14067 | 0.004 |
| 1315.21221 | 0.002 |
| 1313.28374 | 0.002 |
| 1311.35528 | 0.001 |
| 1309.42682 | 0.001 |
| 1307.49835 | 0.001 |
| 1305.56989 | 0.001 |
| 1303.64143 | 0.001 |
| 1301.71296 | 0.001 |
| 1299.7845 | 0.001 |
| 1297.85604 | 0.001 |
| 1295.92757 | 0.001 |
| 1293.99911 | 0.001 |
| 1292.07064 | 0 |
| 1290.14218 | 0 |
| 1288.21372 | 0 |
| 1286.28525 | 0 |
| 1284.35679 | 0 |
| 1282.42833 | 0 |
| 1280.49986 | 0 |
| 1278.5714 | 0 |
| 1276.64294 | 0 |
| 1274.71447 | 0 |
| 1272.78601 | 0 |
| 1270.85754 | 0 |
| 1268.92908 | 0 |
| 1267.00062 | 0 |
| 1265.07215 | 0 |
| 1263.14369 | 0.001 |
| 1261.21523 | 0.001 |
| 1259.28676 | 0.002 |
| 1257.3583 | 0.003 |
| 1255.42984 | 0.004 |
| 1253.50137 | 0.006 |
| 1251.57291 | 0.008 |
| 1249.64444 | 0.011 |
| 1247.71598 | 0.016 |
| 1245.78752 | 0.022 |
| 1243.85905 | 0.029 |
| 1241.93059 | 0.033 |
| 1240.00213 | 0.034 |
| 1238.07366 | 0.033 |
| 1236.1452 | 0.033 |
| 1234.21674 | 0.036 |
| 1232.28827 | 0.039 |
| 1230.35981 | 0.039 |
| 1228.43134 | 0.036 |
| 1226.50288 | 0.031 |
| 1224.57442 | 0.026 |
| 1222.64595 | 0.021 |
| 1220.71749 | 0.018 |
| 1218.78903 | 0.016 |
| 1216.86056 | 0.015 |
| 1214.9321 | 0.016 |
| 1213.00364 | 0.019 |
| 1211.07517 | 0.025 |
| 1209.14671 | 0.029 |
| 1207.21824 | 0.03 |
| 1205.28978 | 0.026 |
| 1203.36132 | 0.022 |
| 1201.43285 | 0.02 |
| 1199.50439 | 0.022 |
| 1197.57593 | 0.027 |
| 1195.64746 | 0.033 |
| 1193.719 | 0.039 |
| 1191.79053 | 0.043 |
| 1189.86207 | 0.046 |
| 1187.93361 | 0.045 |
| 1186.00514 | 0.042 |
| 1184.07668 | 0.038 |
| 1182.14822 | 0.033 |
| 1180.21975 | 0.029 |
| 1178.29129 | 0.025 |
| 1176.36283 | 0.022 |
| 1174.43436 | 0.019 |
| 1172.5059 | 0.018 |
| 1170.57743 | 0.017 |
| 1168.64897 | 0.018 |
| 1166.72051 | 0.021 |
| 1164.79204 | 0.026 |
| 1162.86358 | 0.031 |
| 1160.93512 | 0.034 |
| 1159.00665 | 0.032 |
| 1157.07819 | 0.028 |
| 1155.14973 | 0.023 |
| 1153.22126 | 0.02 |
| 1151.2928 | 0.017 |
| 1149.36433 | 0.015 |
| 1147.43587 | 0.014 |
| 1145.50741 | 0.012 |
| 1143.57894 | 0.011 |
| 1141.65048 | 0.01 |
| 1139.72202 | 0.009 |
| 1137.79355 | 0.009 |
| 1135.86509 | 0.008 |
| 1133.93663 | 0.007 |
| 1132.00816 | 0.007 |
| 1130.0797 | 0.007 |
| 1128.15123 | 0.006 |
| 1126.22277 | 0.006 |
| 1124.29431 | 0.005 |
| 1122.36584 | 0.005 |
| 1120.43738 | 0.005 |
| 1118.50892 | 0.005 |
| 1116.58045 | 0.004 |
| 1114.65199 | 0.004 |
| 1112.72353 | 0.004 |
| 1110.79506 | 0.004 |
| 1108.8666 | 0.003 |
| 1106.93813 | 0.003 |
| 1105.00967 | 0.003 |
| 1103.08121 | 0.003 |
| 1101.15274 | 0.003 |
| 1099.22428 | 0.003 |
| 1097.29582 | 0.003 |
| 1095.36735 | 0.003 |
| 1093.43889 | 0.002 |
| 1091.51043 | 0.002 |
| 1089.58196 | 0.002 |
| 1087.6535 | 0.002 |
| 1085.72503 | 0.002 |
| 1083.79657 | 0.002 |
| 1081.86811 | 0.002 |
| 1079.93964 | 0.003 |
| 1078.01118 | 0.003 |
| 1076.08272 | 0.004 |
| 1074.15425 | 0.006 |
| 1072.22579 | 0.009 |
| 1070.29733 | 0.014 |
| 1068.36886 | 0.02 |
| 1066.4404 | 0.026 |
| 1064.51193 | 0.032 |
| 1062.58347 | 0.037 |
| 1060.65501 | 0.041 |
| 1058.72654 | 0.044 |
| 1056.79808 | 0.043 |
| 1054.86962 | 0.038 |
| 1052.94115 | 0.031 |
| 1051.01269 | 0.026 |
| 1049.08422 | 0.022 |
| 1047.15576 | 0.02 |
| 1045.2273 | 0.018 |
| 1043.29883 | 0.017 |
| 1041.37037 | 0.017 |
| 1039.44191 | 0.019 |
| 1037.51344 | 0.023 |
| 1035.58498 | 0.029 |
| 1033.65652 | 0.034 |
| 1031.72805 | 0.038 |
| 1029.79959 | 0.04 |
| 1027.87112 | 0.04 |
| 1025.94266 | 0.038 |
| 1024.0142 | 0.036 |
| 1022.08573 | 0.034 |
| 1020.15727 | 0.032 |
| 1018.22881 | 0.029 |
| 1016.30034 | 0.026 |
| 1014.37188 | 0.024 |
| 1012.44342 | 0.021 |
| 1010.51495 | 0.019 |
| 1008.58649 | 0.017 |
| 1006.65802 | 0.016 |
| 1004.72956 | 0.015 |
| 1002.8011 | 0.014 |
| 1000.87263 | 0.013 |
| 998.94417 | 0.012 |
| 997.01571 | 0.011 |
| 995.08724 | 0.01 |
| 993.15878 | 0.01 |
| 991.23032 | 0.009 |
| 989.30185 | 0.009 |
| 987.37339 | 0.008 |
| 985.44492 | 0.008 |
| 983.51646 | 0.008 |
| 981.588 | 0.007 |
| 979.65953 | 0.007 |
| 977.73107 | 0.007 |
| 975.80261 | 0.007 |
| 973.87414 | 0.007 |
| 971.94568 | 0.006 |
| 970.01722 | 0.006 |
| 968.08875 | 0.006 |
| 966.16029 | 0.008 |
| 964.23182 | 0.01 |
| 962.30336 | 0.013 |
| 960.3749 | 0.014 |
| 958.44643 | 0.012 |
| 956.51797 | 0.01 |
| 954.58951 | 0.008 |
| 952.66104 | 0.007 |
| 950.73258 | 0.006 |
| 948.80412 | 0.006 |
| 946.87565 | 0.006 |
| 944.94719 | 0.007 |
| 943.01872 | 0.008 |
| 941.09026 | 0.009 |
| 939.1618 | 0.008 |
| 937.23333 | 0.008 |
| 935.30487 | 0.008 |
| 933.37641 | 0.008 |
| 931.44794 | 0.007 |
| 929.51948 | 0.006 |
| 927.59102 | 0.006 |
| 925.66255 | 0.005 |
| 923.73409 | 0.005 |
| 921.80562 | 0.004 |
| 919.87716 | 0.004 |
| 917.9487 | 0.004 |
| 916.02023 | 0.004 |
| 914.09177 | 0.004 |
| 912.16331 | 0.004 |
| 910.23484 | 0.003 |
| 908.30638 | 0.003 |
| 906.37791 | 0.003 |
| 904.44945 | 0.003 |
| 902.52099 | 0.003 |
| 900.59252 | 0.004 |
| 898.66406 | 0.004 |
| 896.7356 | 0.003 |
| 894.80713 | 0.003 |
| 892.87867 | 0.003 |
| 890.95021 | 0.003 |
| 889.02174 | 0.003 |
| 887.09328 | 0.002 |
| 885.16481 | 0.002 |
| 883.23635 | 0.002 |
| 881.30789 | 0.002 |
| 879.37942 | 0.002 |
| 877.45096 | 0.002 |
| 875.5225 | 0.002 |
| 873.59403 | 0.002 |
| 871.66557 | 0.002 |
| 869.73711 | 0.002 |
| 867.80864 | 0.002 |
| 865.88018 | 0.002 |
| 863.95171 | 0.002 |
| 862.02325 | 0.002 |
| 860.09479 | 0.002 |
| 858.16632 | 0.001 |
| 856.23786 | 0.001 |
| 854.3094 | 0.001 |
| 852.38093 | 0.001 |
| 850.45247 | 0.001 |
| 848.52401 | 0.001 |
| 846.59554 | 0.001 |
| 844.66708 | 0.001 |
| 842.73861 | 0.001 |
| 840.81015 | 0.001 |
| 838.88169 | 0.001 |
| 836.95322 | 0.001 |
| 835.02476 | 0.001 |
| 833.0963 | 0.001 |
| 831.16783 | 0.001 |
| 829.23937 | 0.001 |
| 827.31091 | 0.001 |
| 825.38244 | 0.001 |
| 823.45398 | 0 |
| 821.52551 | 0 |
| 819.59705 | 0 |
| 817.66859 | 0 |
| 815.74012 | 0 |
| 813.81166 | 0 |
| 811.8832 | 0 |
| 809.95473 | 0 |
| 808.02627 | 0 |
| 806.09781 | 0 |
| 804.16934 | 0.001 |
| 802.24088 | 0.002 |
| 800.31241 | 0.003 |
| 798.38395 | 0.007 |
| 796.45549 | 0.013 |
| 794.52702 | 0.019 |
| 792.59856 | 0.021 |
| 790.6701 | 0.021 |
| 788.74163 | 0.017 |
| 786.81317 | 0.011 |
| 784.88471 | 0.007 |
| 782.95624 | 0.005 |
| 781.02778 | 0.004 |
| 779.09931 | 0.003 |
| 777.17085 | 0.004 |
| 775.24239 | 0.008 |
| 773.31392 | 0.014 |
| 771.38546 | 0.019 |
| 769.457 | 0.019 |
| 767.52853 | 0.016 |
| 765.60007 | 0.012 |
| 763.6716 | 0.009 |
| 761.74314 | 0.007 |
| 759.81468 | 0.006 |
| 757.88621 | 0.005 |
| 755.95775 | 0.004 |
| 754.02929 | 0.004 |
| 752.10082 | 0.003 |
| 750.17236 | 0.003 |
| 748.2439 | 0.002 |
| 746.31543 | 0.002 |
| 744.38697 | 0.002 |
| 742.4585 | 0.002 |
| 740.53004 | 0.002 |
| 738.60158 | 0.001 |
| 736.67311 | 0.001 |
| 734.74465 | 0.001 |
| 732.81619 | 0.001 |
| 730.88772 | 0.001 |
| 728.95926 | 0.001 |
| 727.0308 | 0.001 |
| 725.10233 | 0.001 |
| 723.17387 | 0.001 |
| 721.2454 | 0.001 |
| 719.31694 | 0.001 |
| 717.38848 | 0.001 |
| 715.46001 | 0.001 |
| 713.53155 | 0.003 |
| 711.60309 | 0.004 |
| 709.67462 | 0.004 |
| 707.74616 | 0.003 |
| 705.8177 | 0.002 |
| 703.88923 | 0.001 |
| 701.96077 | 0.001 |
| 700.0323 | 0.001 |
| 698.10384 | 0 |
| 696.17538 | 0 |
| 694.24691 | 0 |
| 692.31845 | 0 |
| 690.38999 | 0 |
| 688.46152 | 0 |
| 686.53306 | 0 |
| 684.6046 | 0 |
| 682.67613 | 0 |
| 680.74767 | 0 |
| 678.8192 | 0 |
| 676.89074 | 0 |
| 674.96228 | 0 |
| 673.03381 | 0 |
| 671.10535 | 0 |
| 669.17689 | 0.001 |
| 667.24842 | 0.002 |
| 665.31996 | 0.003 |
| 663.3915 | 0.004 |
| 661.46303 | 0.002 |
| 659.53457 | 0.001 |
| 657.6061 | 0.001 |
| 655.67764 | 0 |
| 653.74918 | 0 |
| 651.82071 | 0 |
| 649.89225 | 0 |
| 647.96379 | 0 |
| 646.03532 | 0 |
| 644.10686 | 0 |
| 642.1784 | 0 |
| 640.24993 | 0 |
| 638.32147 | 0 |
| 636.393 | 0 |
| 634.46454 | 0 |
| 632.53608 | 0 |
| 630.60761 | 0 |
| 628.67915 | 0 |
| 626.75069 | 0.001 |
| 624.82222 | 0.002 |
| 622.89376 | 0.004 |
| 620.96529 | 0.008 |
| 619.03683 | 0.015 |
| 617.10837 | 0.021 |
| 615.1799 | 0.026 |
| 613.25144 | 0.029 |
| 611.32298 | 0.029 |
| 609.39451 | 0.027 |
| 607.46605 | 0.023 |
| 605.53759 | 0.018 |
| 603.60912 | 0.015 |
| 601.68066 | 0.011 |
| 599.75219 | 0.009 |
| 597.82373 | 0.007 |
| 595.89527 | 0.006 |
| 593.9668 | 0.005 |
| 592.03834 | 0.004 |
| 590.10988 | 0.004 |
| 588.18141 | 0.004 |
| 586.25295 | 0.006 |
| 584.32449 | 0.009 |
| 582.39602 | 0.011 |
| 580.46756 | 0.01 |
| 578.53909 | 0.007 |
| 576.61063 | 0.005 |
| 574.68217 | 0.004 |
| 572.7537 | 0.004 |
| 570.82524 | 0.003 |
| 568.89678 | 0.002 |
| 566.96831 | 0.002 |
| 565.03985 | 0.001 |
| 563.11139 | 0.001 |
| 561.18292 | 0.001 |
| 559.25446 | 0.001 |
| 557.32599 | 0.001 |
| 555.39753 | 0.001 |
| 553.46907 | 0 |
| 551.5406 | 0 |
| 549.61214 | 0 |
| 547.68368 | 0 |
| 545.75521 | 0 |
| 543.82675 | 0 |
| 541.89829 | 0 |
| 539.96982 | 0 |
| 538.04136 | 0 |
| 536.11289 | 0 |
| 534.18443 | 0 |
| 532.25597 | 0 |
| 530.3275 | 0 |
| 528.39904 | 0 |
| 526.47058 | 0 |
| 524.54211 | 0 |
| 522.61365 | 0.001 |
| 520.68519 | 0.002 |
| 518.75672 | 0.004 |
| 516.82826 | 0.008 |
| 514.89979 | 0.011 |
| 512.97133 | 0.01 |
| 511.04287 | 0.007 |
| 509.1144 | 0.004 |
| 507.18594 | 0.002 |
| 505.25748 | 0.001 |
| 503.32901 | 0.001 |
| 501.40055 | 0 |
| 499.47209 | 0 |